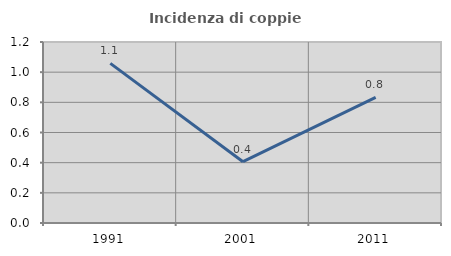
| Category | Incidenza di coppie miste |
|---|---|
| 1991.0 | 1.058 |
| 2001.0 | 0.406 |
| 2011.0 | 0.833 |